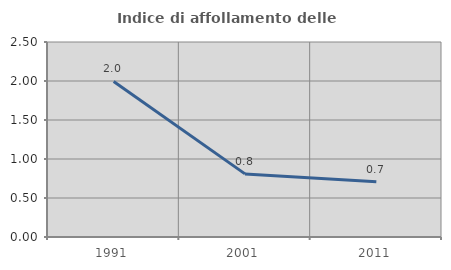
| Category | Indice di affollamento delle abitazioni  |
|---|---|
| 1991.0 | 1.994 |
| 2001.0 | 0.809 |
| 2011.0 | 0.708 |